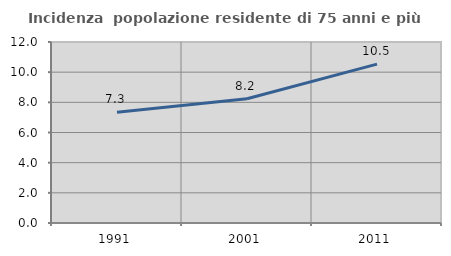
| Category | Incidenza  popolazione residente di 75 anni e più |
|---|---|
| 1991.0 | 7.34 |
| 2001.0 | 8.234 |
| 2011.0 | 10.534 |